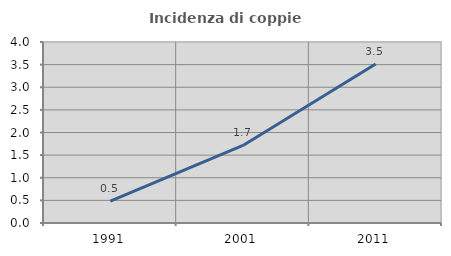
| Category | Incidenza di coppie miste |
|---|---|
| 1991.0 | 0.482 |
| 2001.0 | 1.715 |
| 2011.0 | 3.515 |